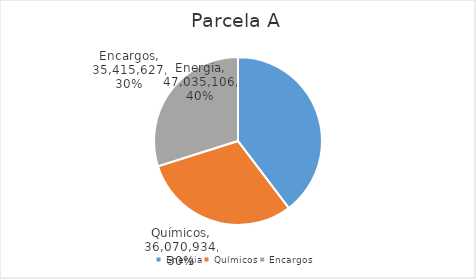
| Category | Series 0 |
|---|---|
| Energia | 47035106.313 |
| Químicos | 36070933.504 |
| Encargos | 35415627.297 |